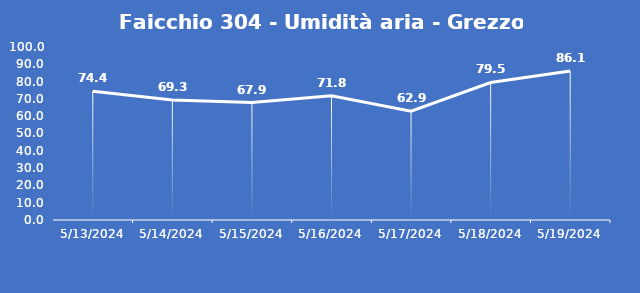
| Category | Faicchio 304 - Umidità aria - Grezzo (%) |
|---|---|
| 5/13/24 | 74.4 |
| 5/14/24 | 69.3 |
| 5/15/24 | 67.9 |
| 5/16/24 | 71.8 |
| 5/17/24 | 62.9 |
| 5/18/24 | 79.5 |
| 5/19/24 | 86.1 |